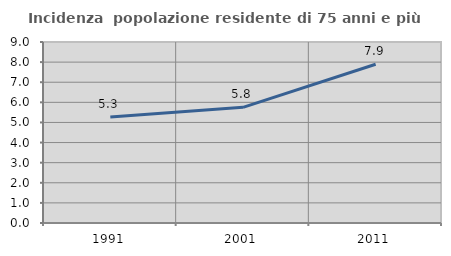
| Category | Incidenza  popolazione residente di 75 anni e più |
|---|---|
| 1991.0 | 5.266 |
| 2001.0 | 5.753 |
| 2011.0 | 7.892 |